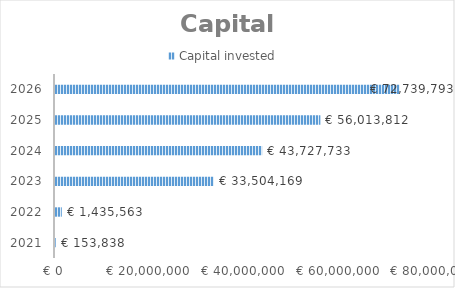
| Category | Capital invested  |
|---|---|
| 2021.0 | 153838.302 |
| 2022.0 | 1435562.696 |
| 2023.0 | 33504169.372 |
| 2024.0 | 43727732.78 |
| 2025.0 | 56013811.654 |
| 2026.0 | 72739793.042 |